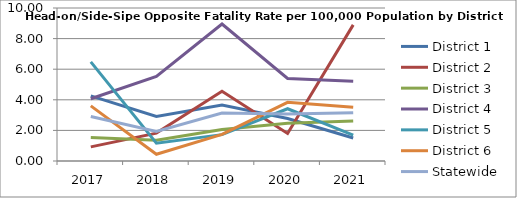
| Category | District 1 | District 2 | District 3 | District 4 | District 5 | District 6 | Statewide |
|---|---|---|---|---|---|---|---|
| 2017.0 | 4.258 | 0.921 | 1.529 | 4.067 | 6.476 | 3.601 | 2.912 |
| 2018.0 | 2.914 | 1.824 | 1.364 | 5.526 | 1.16 | 0.442 | 1.938 |
| 2019.0 | 3.661 | 4.555 | 2.057 | 8.954 | 1.724 | 1.74 | 3.134 |
| 2020.0 | 2.773 | 1.8 | 2.473 | 5.392 | 3.416 | 3.837 | 3.065 |
| 2021.0 | 1.507 | 8.895 | 2.619 | 5.214 | 1.685 | 3.517 | 3.156 |